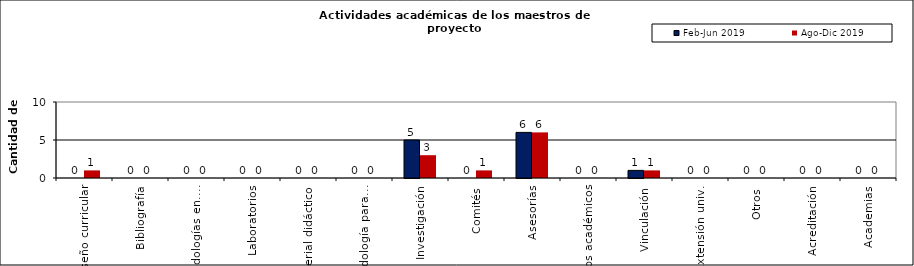
| Category | Feb-Jun 2019 | Ago-Dic 2019 |
|---|---|---|
| Diseño curricular | 0 | 1 |
| Bibliografía | 0 | 0 |
| Metodologías en.... | 0 | 0 |
| Laboratorios | 0 | 0 |
| Material didáctico | 0 | 0 |
| Metodología para... | 0 | 0 |
| Investigación | 5 | 3 |
| Comités | 0 | 1 |
| Asesorías | 6 | 6 |
| Clubs académicos | 0 | 0 |
| Vinculación | 1 | 1 |
| Extensión univ. | 0 | 0 |
| Otros | 0 | 0 |
| Acreditación | 0 | 0 |
| Academias | 0 | 0 |